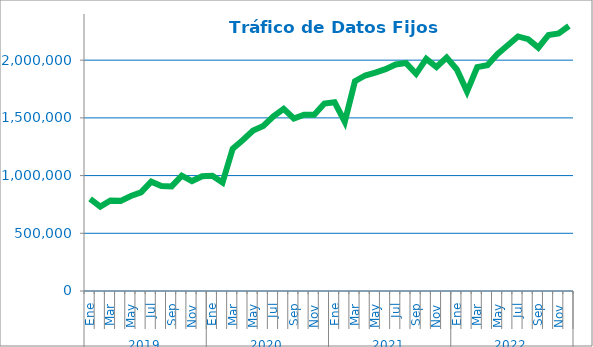
| Category | Series 2 |
|---|---|
| 0 | 798685.918 |
| 1 | 731575.817 |
| 2 | 784749.128 |
| 3 | 780968.133 |
| 4 | 823287.283 |
| 5 | 854090.708 |
| 6 | 947593.778 |
| 7 | 909855.298 |
| 8 | 906240.596 |
| 9 | 999396.547 |
| 10 | 952644.18 |
| 11 | 994702.802 |
| 12 | 998043.119 |
| 13 | 939529.747 |
| 14 | 1233422.945 |
| 15 | 1308700.517 |
| 16 | 1390818.383 |
| 17 | 1429389.058 |
| 18 | 1513898.129 |
| 19 | 1578469.308 |
| 20 | 1494651.805 |
| 21 | 1527689.762 |
| 22 | 1527595.376 |
| 23 | 1624013.076 |
| 24 | 1635978.542 |
| 25 | 1466373.79 |
| 26 | 1817279.963 |
| 27 | 1867095.32 |
| 28 | 1892209.579 |
| 29 | 1921759.576 |
| 30 | 1962438.137 |
| 31 | 1975182.781 |
| 32 | 1881672.102 |
| 33 | 2010730.589 |
| 34 | 1940295.941 |
| 35 | 2022499.807 |
| 36 | 1919833.376 |
| 37 | 1727728.602 |
| 38 | 1940004.078 |
| 39 | 1956419.243 |
| 40 | 2053840.816 |
| 41 | 2128659.745 |
| 42 | 2205401.772 |
| 43 | 2182241.374 |
| 44 | 2108599.929 |
| 45 | 2218197.312 |
| 46 | 2232305.486 |
| 47 | 2295742.928 |